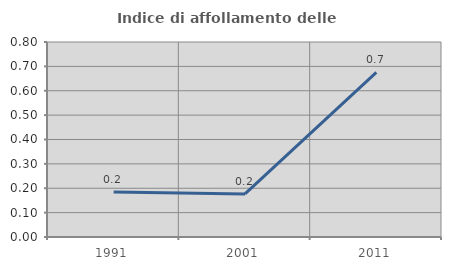
| Category | Indice di affollamento delle abitazioni  |
|---|---|
| 1991.0 | 0.184 |
| 2001.0 | 0.177 |
| 2011.0 | 0.676 |